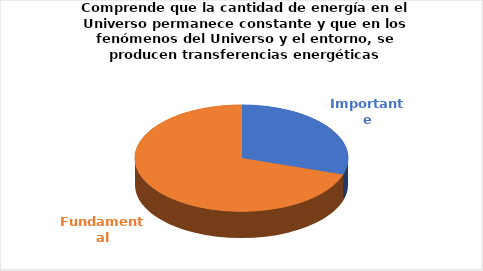
| Category | Series 0 |
|---|---|
| Importante | 3 |
| Fundamental | 7 |